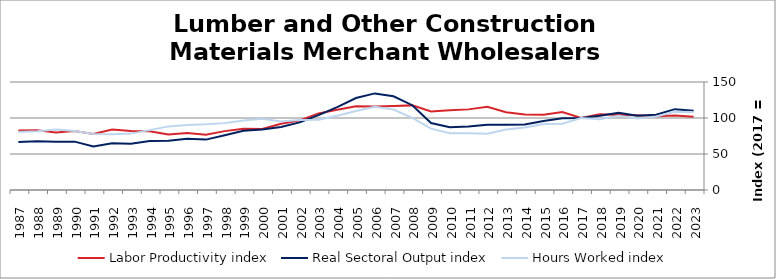
| Category | Labor Productivity index | Real Sectoral Output index | Hours Worked index |
|---|---|---|---|
| 2023.0 | 101.667 | 110.052 | 108.248 |
| 2022.0 | 103.324 | 112.278 | 108.667 |
| 2021.0 | 102.57 | 104.6 | 101.979 |
| 2020.0 | 103.868 | 103.13 | 99.29 |
| 2019.0 | 104.29 | 107.355 | 102.938 |
| 2018.0 | 105.139 | 103.263 | 98.216 |
| 2017.0 | 100 | 100 | 100 |
| 2016.0 | 108.212 | 99.556 | 92.001 |
| 2015.0 | 104.494 | 95.767 | 91.648 |
| 2014.0 | 104.854 | 90.97 | 86.759 |
| 2013.0 | 108.035 | 90.737 | 83.988 |
| 2012.0 | 115.701 | 90.498 | 78.217 |
| 2011.0 | 111.976 | 88.22 | 78.785 |
| 2010.0 | 110.718 | 87.238 | 78.793 |
| 2009.0 | 109.099 | 93.038 | 85.279 |
| 2008.0 | 117.531 | 117.746 | 100.183 |
| 2007.0 | 116.572 | 130.222 | 111.709 |
| 2006.0 | 115.96 | 134.166 | 115.7 |
| 2005.0 | 116.423 | 127.731 | 109.712 |
| 2004.0 | 111.544 | 115.11 | 103.197 |
| 2003.0 | 106.374 | 103.921 | 97.694 |
| 2002.0 | 96.492 | 93.89 | 97.304 |
| 2001.0 | 91.931 | 87.448 | 95.124 |
| 2000.0 | 84.707 | 83.889 | 99.034 |
| 1999.0 | 84.965 | 82.139 | 96.673 |
| 1998.0 | 81.78 | 75.957 | 92.88 |
| 1997.0 | 76.766 | 69.978 | 91.157 |
| 1996.0 | 79.044 | 71.259 | 90.15 |
| 1995.0 | 77.25 | 68.261 | 88.364 |
| 1994.0 | 81.734 | 67.977 | 83.169 |
| 1993.0 | 81.964 | 64.188 | 78.313 |
| 1992.0 | 83.919 | 65.079 | 77.549 |
| 1991.0 | 77.94 | 60.545 | 77.682 |
| 1990.0 | 81.923 | 67.145 | 81.96 |
| 1989.0 | 79.76 | 66.95 | 83.939 |
| 1988.0 | 83.049 | 67.757 | 81.587 |
| 1987.0 | 82.707 | 66.65 | 80.585 |